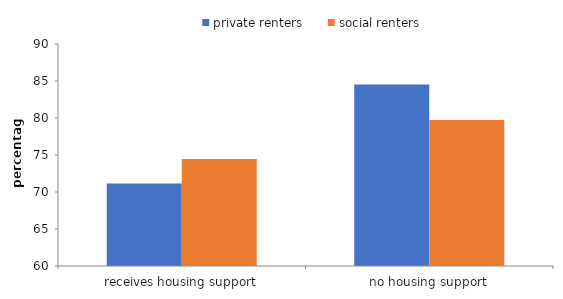
| Category | private renters | social renters |
|---|---|---|
| receives housing support | 71.157 | 74.449 |
| no housing support | 84.516 | 79.744 |